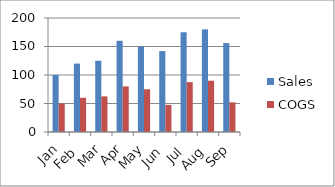
| Category | Sales | COGS |
|---|---|---|
| Jan | 100 | 50 |
| Feb | 120 | 60 |
| Mar | 125 | 62.5 |
| Apr | 160 | 80 |
| May | 150 | 75 |
| Jun | 142 | 47.5 |
| Jul | 175 | 87.5 |
| Aug | 180 | 90 |
| Sep | 156 | 52 |